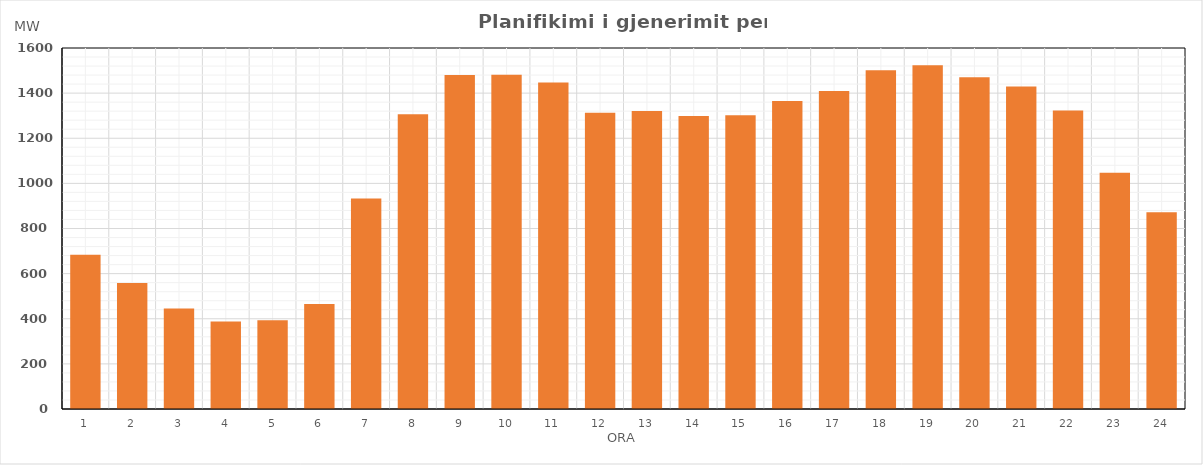
| Category | Max (MW) |
|---|---|
| 0 | 683.48 |
| 1 | 558.89 |
| 2 | 445.91 |
| 3 | 387.88 |
| 4 | 392.9 |
| 5 | 465.9 |
| 6 | 933.26 |
| 7 | 1306.5 |
| 8 | 1480.16 |
| 9 | 1481.89 |
| 10 | 1446.81 |
| 11 | 1312.94 |
| 12 | 1320.64 |
| 13 | 1298.51 |
| 14 | 1301.85 |
| 15 | 1364.7 |
| 16 | 1409.35 |
| 17 | 1501.5 |
| 18 | 1523.12 |
| 19 | 1470.35 |
| 20 | 1429.6 |
| 21 | 1322.45 |
| 22 | 1047.55 |
| 23 | 872.25 |